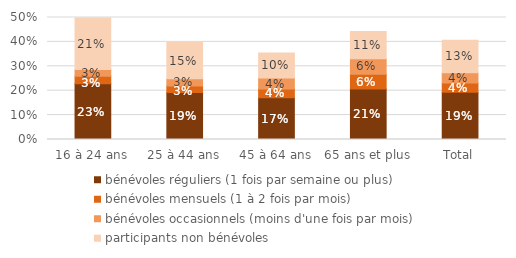
| Category | bénévoles réguliers (1 fois par semaine ou plus) | bénévoles mensuels (1 à 2 fois par mois) | bénévoles occasionnels (moins d'une fois par mois) | participants non bénévoles |
|---|---|---|---|---|
| 16 à 24 ans | 0.228 | 0.031 | 0.028 | 0.212 |
| 25 à 44 ans | 0.193 | 0.027 | 0.03 | 0.149 |
| 45 à 64 ans | 0.172 | 0.036 | 0.045 | 0.103 |
| 65 ans et plus | 0.207 | 0.061 | 0.064 | 0.111 |
| Total | 0.194 | 0.038 | 0.042 | 0.133 |